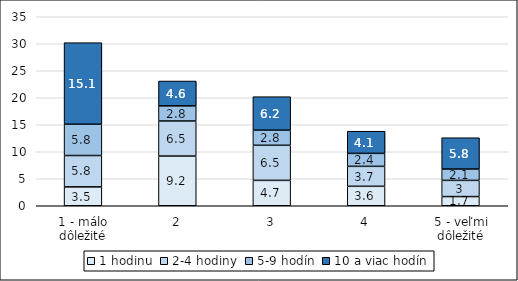
| Category | 1 hodinu | 2-4 hodiny | 5-9 hodín | 10 a viac hodín |
|---|---|---|---|---|
| 1 - málo dôležité | 3.5 | 5.8 | 5.8 | 15.1 |
| 2 | 9.2 | 6.5 | 2.8 | 4.6 |
| 3 | 4.7 | 6.5 | 2.8 | 6.2 |
| 4 | 3.6 | 3.7 | 2.4 | 4.1 |
| 5 - veľmi dôležité | 1.7 | 3 | 2.1 | 5.8 |